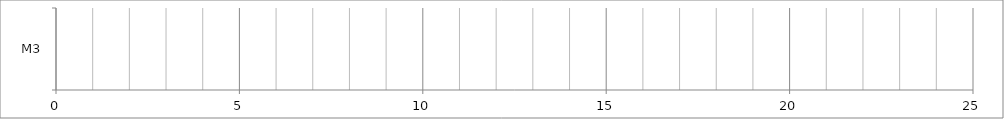
| Category | X | 0 |
|---|---|---|
| M3 | 0 | 0 |